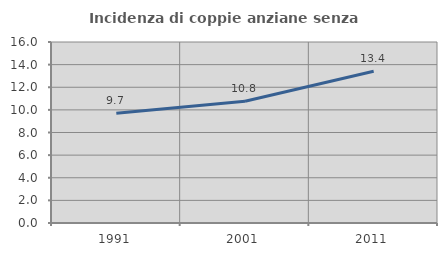
| Category | Incidenza di coppie anziane senza figli  |
|---|---|
| 1991.0 | 9.7 |
| 2001.0 | 10.759 |
| 2011.0 | 13.418 |